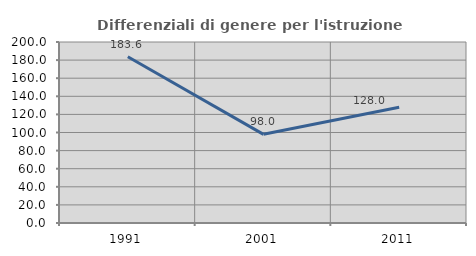
| Category | Differenziali di genere per l'istruzione superiore |
|---|---|
| 1991.0 | 183.622 |
| 2001.0 | 97.974 |
| 2011.0 | 127.991 |